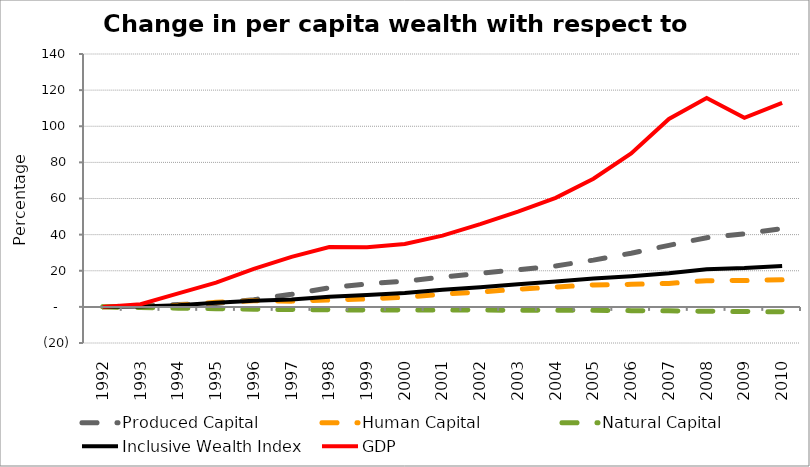
| Category | Produced Capital  | Human Capital | Natural Capital | Inclusive Wealth Index | GDP |
|---|---|---|---|---|---|
| 1992.0 | 0 | 0 | 0 | 0 | 0 |
| 1993.0 | 0.695 | 0.108 | -0.371 | 0.263 | 1.507 |
| 1994.0 | 1.261 | 0.909 | -0.714 | 0.962 | 7.438 |
| 1995.0 | 1.876 | 2.577 | -1.025 | 2.269 | 13.396 |
| 1996.0 | 3.998 | 3.412 | -1.281 | 3.441 | 20.999 |
| 1997.0 | 6.966 | 3.168 | -1.485 | 4.123 | 27.723 |
| 1998.0 | 10.532 | 3.822 | -1.635 | 5.591 | 33.13 |
| 1999.0 | 12.733 | 4.406 | -1.711 | 6.62 | 33.063 |
| 2000.0 | 14.223 | 5.317 | -1.744 | 7.67 | 34.798 |
| 2001.0 | 16.461 | 7.053 | -1.737 | 9.499 | 39.432 |
| 2002.0 | 18.642 | 8.226 | -1.79 | 10.926 | 45.794 |
| 2003.0 | 20.553 | 9.796 | -1.812 | 12.546 | 52.726 |
| 2004.0 | 22.679 | 11.008 | -1.848 | 13.984 | 60.387 |
| 2005.0 | 25.896 | 12.17 | -1.901 | 15.702 | 70.931 |
| 2006.0 | 29.703 | 12.49 | -2.088 | 17.009 | 84.97 |
| 2007.0 | 34.073 | 12.988 | -2.2 | 18.603 | 104.048 |
| 2008.0 | 38.302 | 14.512 | -2.406 | 20.854 | 115.656 |
| 2009.0 | 40.394 | 14.566 | -2.581 | 21.487 | 104.666 |
| 2010.0 | 43.37 | 14.999 | -2.734 | 22.635 | 112.954 |